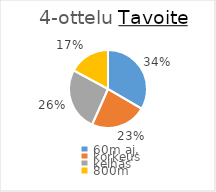
| Category | Series 0 |
|---|---|
| 60m aj. | 381 |
| korkeus | 265 |
| keihäs | 299 |
| 800m | 195 |